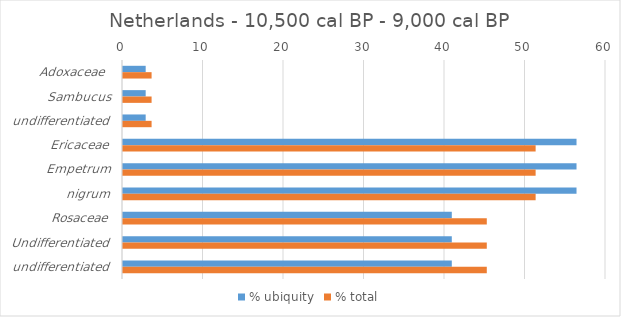
| Category | % ubiquity | % total |
|---|---|---|
| Adoxaceae  | 2.817 | 3.551 |
| Sambucus | 2.817 | 3.551 |
| undifferentiated | 2.817 | 3.551 |
| Ericaceae | 56.338 | 51.257 |
| Empetrum | 56.338 | 51.257 |
| nigrum | 56.338 | 51.257 |
| Rosaceae | 40.845 | 45.191 |
| Undifferentiated | 40.845 | 45.191 |
| undifferentiated | 40.845 | 45.191 |